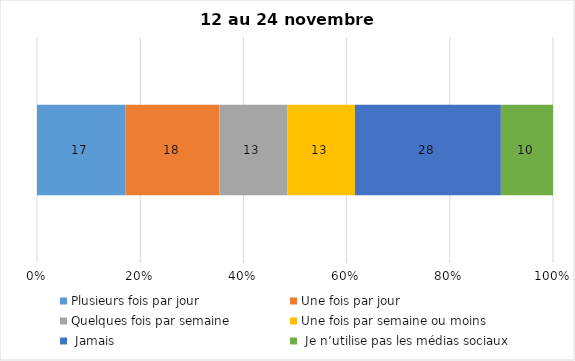
| Category | Plusieurs fois par jour | Une fois par jour | Quelques fois par semaine   | Une fois par semaine ou moins   |  Jamais   |  Je n’utilise pas les médias sociaux |
|---|---|---|---|---|---|---|
| 0 | 17 | 18 | 13 | 13 | 28 | 10 |